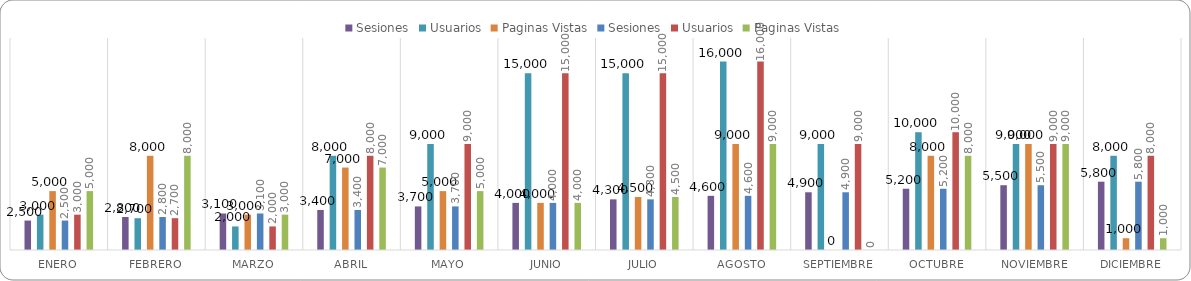
| Category | Sesiones | Usuarios | Paginas Vistas |
|---|---|---|---|
| Enero | 2500 | 3000 | 5000 |
| Febrero | 2800 | 2700 | 8000 |
| Marzo | 3100 | 2000 | 3000 |
| Abril | 3400 | 8000 | 7000 |
| Mayo | 3700 | 9000 | 5000 |
| Junio | 4000 | 15000 | 4000 |
| Julio | 4300 | 15000 | 4500 |
| Agosto | 4600 | 16000 | 9000 |
| Septiembre | 4900 | 9000 | 0 |
| Octubre | 5200 | 10000 | 8000 |
| Noviembre | 5500 | 9000 | 9000 |
| Diciembre | 5800 | 8000 | 1000 |